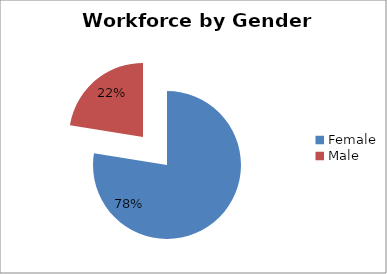
| Category | Series 0 |
|---|---|
| Female | 77.535 |
| Male | 22.465 |